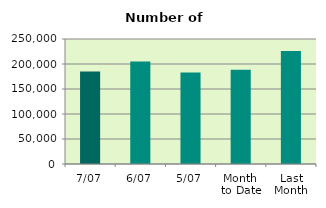
| Category | Series 0 |
|---|---|
| 7/07 | 185202 |
| 6/07 | 205148 |
| 5/07 | 182926 |
| Month 
to Date | 188580.4 |
| Last
Month | 226069.545 |